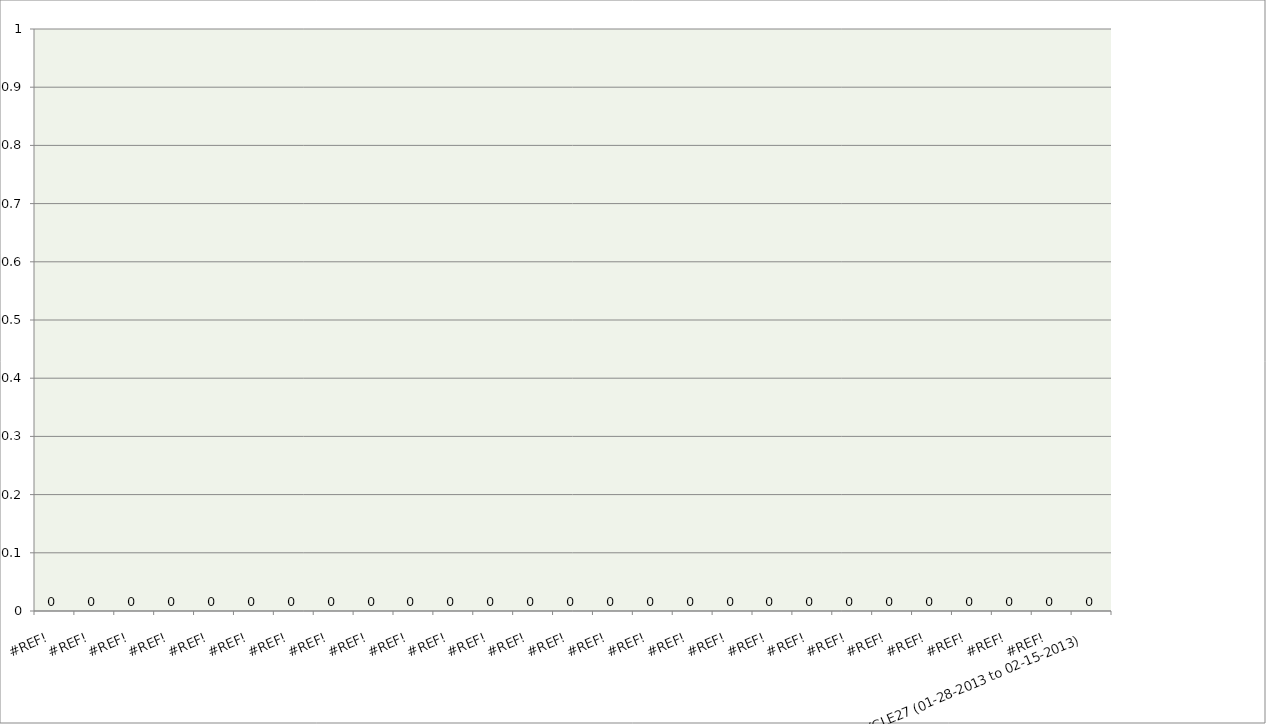
| Category | Series 0 |
|---|---|
| #REF! | 0 |
| #REF! | 0 |
| #REF! | 0 |
| #REF! | 0 |
| #REF! | 0 |
| #REF! | 0 |
| #REF! | 0 |
| #REF! | 0 |
| #REF! | 0 |
| #REF! | 0 |
| #REF! | 0 |
| #REF! | 0 |
| #REF! | 0 |
| #REF! | 0 |
| #REF! | 0 |
| #REF! | 0 |
| #REF! | 0 |
| #REF! | 0 |
| #REF! | 0 |
| #REF! | 0 |
| #REF! | 0 |
| #REF! | 0 |
| #REF! | 0 |
| #REF! | 0 |
| #REF! | 0 |
| #REF! | 0 |
| CYCLE27 (01-28-2013 to 02-15-2013) | 0 |